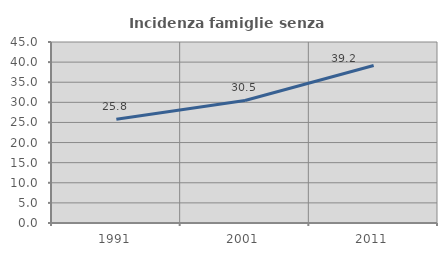
| Category | Incidenza famiglie senza nuclei |
|---|---|
| 1991.0 | 25.781 |
| 2001.0 | 30.464 |
| 2011.0 | 39.157 |